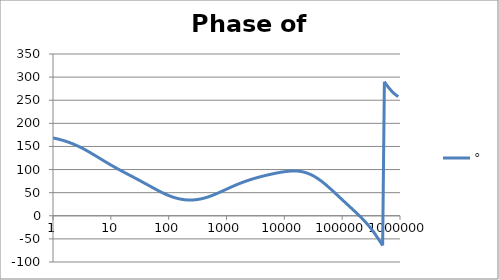
| Category | ° |
|---|---|
| 1.0 | 168.461 |
| 1.0715193052376064 | 167.655 |
| 1.1481536214968828 | 166.796 |
| 1.2302687708123814 | 165.882 |
| 1.318256738556407 | 164.908 |
| 1.4125375446227544 | 163.873 |
| 1.513561248436208 | 162.773 |
| 1.6218100973589298 | 161.605 |
| 1.7378008287493754 | 160.368 |
| 1.8620871366628673 | 159.06 |
| 1.9952623149688797 | 157.677 |
| 2.1379620895022318 | 156.219 |
| 2.2908676527677727 | 154.685 |
| 2.45470891568503 | 153.074 |
| 2.6302679918953817 | 151.386 |
| 2.8183829312644537 | 149.623 |
| 3.0199517204020156 | 147.786 |
| 3.235936569296282 | 145.878 |
| 3.467368504525316 | 143.904 |
| 3.7153522909717256 | 141.866 |
| 3.9810717055349727 | 139.771 |
| 4.265795188015926 | 137.626 |
| 4.570881896148749 | 135.436 |
| 4.897788193684462 | 133.211 |
| 5.2480746024977245 | 130.957 |
| 5.62341325190349 | 128.684 |
| 6.025595860743575 | 126.398 |
| 6.456542290346554 | 124.108 |
| 6.918309709189363 | 121.821 |
| 7.4131024130091765 | 119.544 |
| 7.943282347242814 | 117.282 |
| 8.511380382023765 | 115.04 |
| 9.120108393559095 | 112.823 |
| 9.772372209558105 | 110.631 |
| 10.47128548050899 | 108.468 |
| 11.22018454301963 | 106.334 |
| 12.022644346174127 | 104.228 |
| 12.88249551693134 | 102.15 |
| 13.803842646028851 | 100.096 |
| 14.791083881682074 | 98.066 |
| 15.848931924611136 | 96.054 |
| 16.98243652461744 | 94.058 |
| 18.197008586099834 | 92.075 |
| 19.498445997580447 | 90.099 |
| 20.892961308540382 | 88.128 |
| 22.387211385683386 | 86.156 |
| 23.988329190194897 | 84.181 |
| 25.703957827688622 | 82.2 |
| 27.54228703338165 | 80.209 |
| 29.51209226666385 | 78.207 |
| 31.62277660168379 | 76.191 |
| 33.884415613920254 | 74.162 |
| 36.307805477010106 | 72.121 |
| 38.90451449942804 | 70.067 |
| 41.686938347033525 | 68.005 |
| 44.6683592150963 | 65.938 |
| 47.86300923226381 | 63.871 |
| 51.28613839913647 | 61.81 |
| 54.95408738576247 | 59.761 |
| 58.88436553555889 | 57.734 |
| 63.09573444801931 | 55.736 |
| 67.60829753919813 | 53.776 |
| 72.44359600749901 | 51.865 |
| 77.62471166286915 | 50.012 |
| 83.17637711026705 | 48.225 |
| 89.12509381337456 | 46.515 |
| 95.49925860214357 | 44.891 |
| 102.32929922807544 | 43.359 |
| 109.64781961431841 | 41.927 |
| 117.48975549395293 | 40.602 |
| 125.89254117941665 | 39.389 |
| 134.89628825916537 | 38.294 |
| 144.54397707459273 | 37.319 |
| 154.88166189124806 | 36.469 |
| 165.95869074375608 | 35.746 |
| 177.82794100389225 | 35.151 |
| 190.5460717963248 | 34.687 |
| 204.17379446695278 | 34.354 |
| 218.77616239495524 | 34.153 |
| 234.42288153199212 | 34.083 |
| 251.18864315095806 | 34.145 |
| 269.15348039269156 | 34.337 |
| 288.4031503126605 | 34.659 |
| 309.0295432513591 | 35.108 |
| 331.1311214825911 | 35.684 |
| 354.81338923357566 | 36.382 |
| 380.18939632056095 | 37.199 |
| 407.3802778041123 | 38.133 |
| 436.5158322401654 | 39.177 |
| 467.7351412871979 | 40.326 |
| 501.18723362727184 | 41.574 |
| 537.0317963702526 | 42.913 |
| 575.4399373371566 | 44.335 |
| 616.5950018614822 | 45.832 |
| 660.6934480075952 | 47.393 |
| 707.9457843841375 | 49.008 |
| 758.5775750291831 | 50.667 |
| 812.8305161640983 | 52.358 |
| 870.9635899560801 | 54.072 |
| 933.2543007969903 | 55.798 |
| 999.9999999999998 | 57.526 |
| 1071.5193052376057 | 59.246 |
| 1148.1536214968828 | 60.95 |
| 1230.2687708123801 | 62.63 |
| 1318.2567385564053 | 64.281 |
| 1412.537544622753 | 65.895 |
| 1513.5612484362066 | 67.47 |
| 1621.8100973589292 | 69.002 |
| 1737.8008287493742 | 70.489 |
| 1862.0871366628671 | 71.928 |
| 1995.2623149688786 | 73.32 |
| 2137.9620895022326 | 74.664 |
| 2290.867652767771 | 75.961 |
| 2454.708915685027 | 77.213 |
| 2630.26799189538 | 78.421 |
| 2818.382931264451 | 79.587 |
| 3019.9517204020176 | 80.713 |
| 3235.9365692962774 | 81.801 |
| 3467.368504525316 | 82.854 |
| 3715.352290971724 | 83.874 |
| 3981.07170553497 | 84.863 |
| 4265.795188015923 | 85.823 |
| 4570.881896148745 | 86.755 |
| 4897.788193684463 | 87.662 |
| 5248.074602497726 | 88.543 |
| 5623.413251903489 | 89.399 |
| 6025.595860743574 | 90.231 |
| 6456.54229034655 | 91.036 |
| 6918.309709189357 | 91.813 |
| 7413.102413009165 | 92.559 |
| 7943.282347242815 | 93.27 |
| 8511.380382023763 | 93.942 |
| 9120.108393559092 | 94.569 |
| 9772.3722095581 | 95.143 |
| 10471.285480509003 | 95.656 |
| 11220.184543019639 | 96.099 |
| 12022.64434617411 | 96.461 |
| 12882.495516931338 | 96.729 |
| 13803.842646028841 | 96.893 |
| 14791.083881682063 | 96.939 |
| 15848.931924611119 | 96.854 |
| 16982.436524617453 | 96.624 |
| 18197.008586099837 | 96.238 |
| 19498.445997580417 | 95.684 |
| 20892.961308540387 | 94.95 |
| 22387.211385683382 | 94.027 |
| 23988.32919019488 | 92.909 |
| 25703.957827688606 | 91.589 |
| 27542.28703338167 | 90.066 |
| 29512.092266663854 | 88.338 |
| 31622.77660168378 | 86.407 |
| 33884.41561392023 | 84.278 |
| 36307.805477010166 | 81.959 |
| 38904.514499428085 | 79.458 |
| 41686.93834703348 | 76.788 |
| 44668.35921509631 | 73.961 |
| 47863.00923226382 | 70.994 |
| 51286.13839913646 | 67.903 |
| 54954.08738576241 | 64.703 |
| 58884.365535558936 | 61.414 |
| 63095.73444801934 | 58.051 |
| 67608.29753919817 | 54.631 |
| 72443.59600749899 | 51.17 |
| 77624.71166286913 | 47.681 |
| 83176.37711026703 | 44.176 |
| 89125.09381337445 | 40.666 |
| 95499.25860214363 | 37.158 |
| 102329.29922807543 | 33.659 |
| 109647.81961431848 | 30.17 |
| 117489.75549395289 | 26.693 |
| 125892.54117941685 | 23.226 |
| 134896.28825916522 | 19.764 |
| 144543.97707459255 | 16.299 |
| 154881.66189124787 | 12.823 |
| 165958.69074375575 | 9.324 |
| 177827.9410038922 | 5.786 |
| 190546.07179632425 | 2.193 |
| 204173.79446695274 | -1.476 |
| 218776.16239495497 | -5.241 |
| 234422.88153199226 | -9.126 |
| 251188.64315095753 | -13.157 |
| 269153.480392691 | -17.359 |
| 288403.15031266044 | -21.757 |
| 309029.5432513582 | -26.373 |
| 331131.1214825907 | -31.221 |
| 354813.3892335749 | -36.308 |
| 380189.3963205612 | -41.622 |
| 407380.2778041119 | -47.137 |
| 436515.8322401649 | -52.801 |
| 467735.14128719777 | -58.543 |
| 501187.2336272717 | -64.273 |
| 537031.7963702519 | 290.109 |
| 575439.9373371559 | 284.702 |
| 616595.001861482 | 279.594 |
| 660693.4480075944 | 274.856 |
| 707945.7843841374 | 270.537 |
| 758577.575029183 | 266.662 |
| 812830.5161640996 | 263.239 |
| 870963.5899560791 | 260.262 |
| 933254.3007969892 | 257.712 |